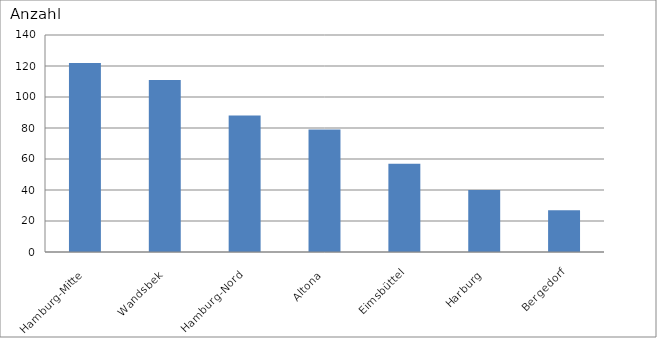
| Category | Hamburg-Mitte Wandsbek Hamburg-Nord Altona Eimsbüttel Harburg Bergedorf |
|---|---|
| Hamburg-Mitte | 122 |
| Wandsbek | 111 |
| Hamburg-Nord | 88 |
| Altona | 79 |
| Eimsbüttel | 57 |
| Harburg | 40 |
| Bergedorf | 27 |